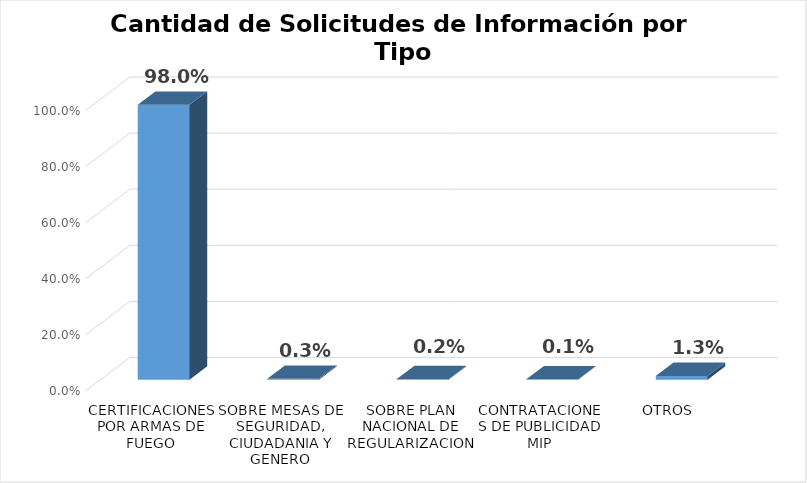
| Category | Series 0 |
|---|---|
| CERTIFICACIONES POR ARMAS DE FUEGO | 0.98 |
| SOBRE MESAS DE SEGURIDAD, CIUDADANIA Y GENERO | 0.003 |
| SOBRE PLAN NACIONAL DE REGULARIZACION | 0.002 |
| CONTRATACIONES DE PUBLICIDAD MIP | 0.001 |
| OTROS | 0.013 |